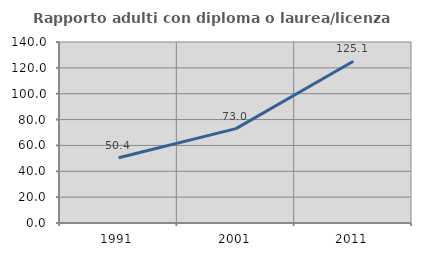
| Category | Rapporto adulti con diploma o laurea/licenza media  |
|---|---|
| 1991.0 | 50.422 |
| 2001.0 | 73.026 |
| 2011.0 | 125.14 |